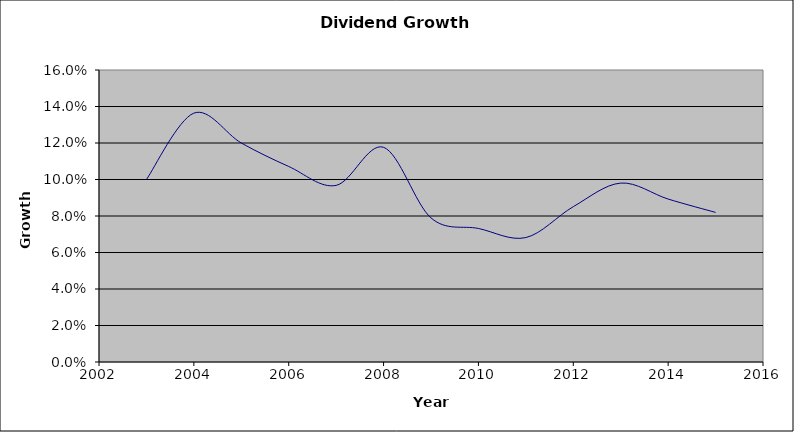
| Category | Series 0 |
|---|---|
| 2003.0 | 0.1 |
| 2004.0 | 0.136 |
| 2005.0 | 0.12 |
| 2006.0 | 0.107 |
| 2007.0 | 0.097 |
| 2008.0 | 0.118 |
| 2009.0 | 0.079 |
| 2010.0 | 0.073 |
| 2011.0 | 0.068 |
| 2012.0 | 0.085 |
| 2013.0 | 0.098 |
| 2014.0 | 0.089 |
| 2015.0 | 0.082 |